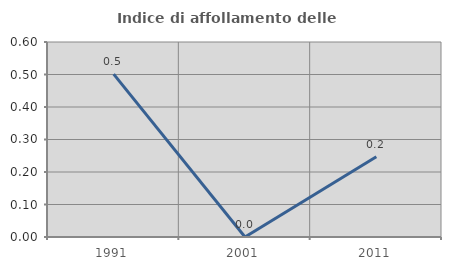
| Category | Indice di affollamento delle abitazioni  |
|---|---|
| 1991.0 | 0.501 |
| 2001.0 | 0 |
| 2011.0 | 0.247 |